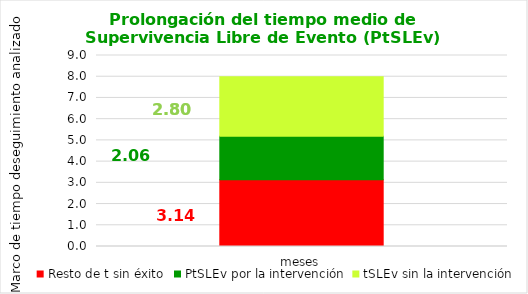
| Category | Resto de t sin éxito | PtSLEv por la intervención | tSLEv sin la intervención |
|---|---|---|---|
| meses | 3.14 | 2.057 | 2.803 |